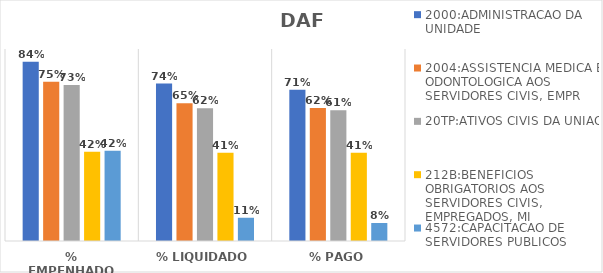
| Category | 2000:ADMINISTRACAO DA UNIDADE | 2004:ASSISTENCIA MEDICA E ODONTOLOGICA AOS SERVIDORES CIVIS, EMPR | 20TP:ATIVOS CIVIS DA UNIAO | 212B:BENEFICIOS OBRIGATORIOS AOS SERVIDORES CIVIS, EMPREGADOS, MI | 4572:CAPACITACAO DE SERVIDORES PUBLICOS FEDERAIS EM PROCESSO DE Q |
|---|---|---|---|---|---|
| % EMPENHADO | 0.84 | 0.746 | 0.731 | 0.419 | 0.423 |
| % LIQUIDADO | 0.738 | 0.646 | 0.622 | 0.414 | 0.109 |
| % PAGO | 0.709 | 0.624 | 0.612 | 0.414 | 0.084 |